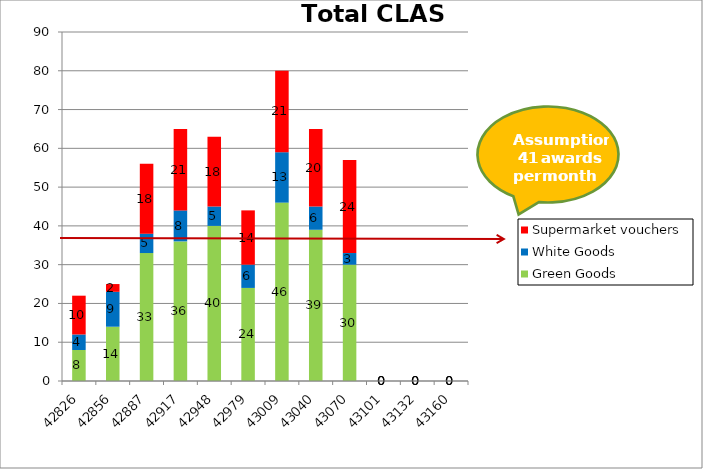
| Category | Green Goods | White Goods | Supermarket vouchers |
|---|---|---|---|
| 42826.0 | 8 | 4 | 10 |
| 42856.0 | 14 | 9 | 2 |
| 42887.0 | 33 | 5 | 18 |
| 42917.0 | 36 | 8 | 21 |
| 42948.0 | 40 | 5 | 18 |
| 42979.0 | 24 | 6 | 14 |
| 43009.0 | 46 | 13 | 21 |
| 43040.0 | 39 | 6 | 20 |
| 43070.0 | 30 | 3 | 24 |
| 43101.0 | 0 | 0 | 0 |
| 43132.0 | 0 | 0 | 0 |
| 43160.0 | 0 | 0 | 0 |